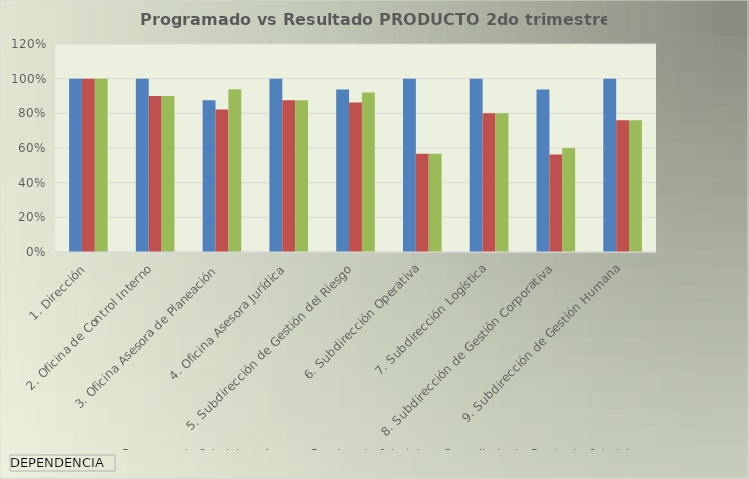
| Category | Programado 2do tri. | Avance Ponderado 2do tri. | Cumplimiento Producto 2do tri. |
|---|---|---|---|
| 1. Dirección | 1 | 1 | 1 |
| 2. Oficina de Control Interno | 1 | 0.9 | 0.9 |
| 3. Oficina Asesora de Planeación | 0.875 | 0.821 | 0.939 |
| 4. Oficina Asesora Jurídica | 1 | 0.875 | 0.875 |
| 5. Subdirección de Gestión del Riesgo | 0.938 | 0.863 | 0.921 |
| 6. Subdirección Operativa | 1 | 0.566 | 0.566 |
| 7. Subdirección Logística | 1 | 0.8 | 0.8 |
| 8. Subdirección de Gestión Corporativa | 0.938 | 0.563 | 0.6 |
| 9. Subdirección de Gestión Humana | 1 | 0.76 | 0.76 |